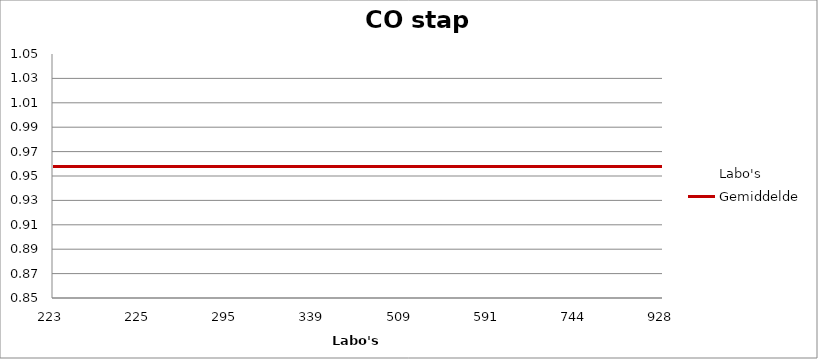
| Category | Labo's | Gemiddelde |
|---|---|---|
| 223.0 | 0.988 | 0.958 |
| 225.0 | 1.012 | 0.958 |
| 295.0 | 0.978 | 0.958 |
| 339.0 | 0.856 | 0.958 |
| 509.0 | 0.975 | 0.958 |
| 591.0 | 0.934 | 0.958 |
| 744.0 | 1.029 | 0.958 |
| 928.0 | 0.89 | 0.958 |